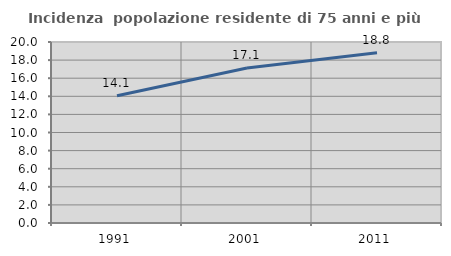
| Category | Incidenza  popolazione residente di 75 anni e più |
|---|---|
| 1991.0 | 14.054 |
| 2001.0 | 17.125 |
| 2011.0 | 18.818 |